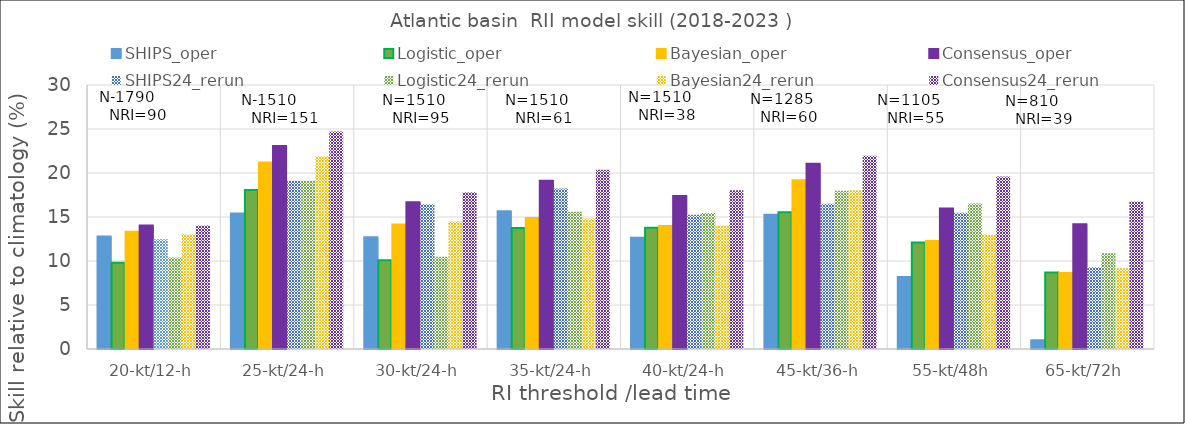
| Category | SHIPS_oper | Logistic_oper | Bayesian_oper | Consensus_oper | SHIPS24_rerun | Logistic24_rerun | Bayesian24_rerun | Consensus24_rerun |
|---|---|---|---|---|---|---|---|---|
| 20-kt/12-h | 12.77 | 9.81 | 13.31 | 14.02 | 12.48 | 10.41 | 13 | 14.03 |
| 25-kt/24-h | 15.39 | 18.07 | 21.18 | 23.08 | 19.11 | 19.11 | 21.9 | 24.73 |
| 30-kt/24-h | 12.69 | 10.09 | 14.15 | 16.67 | 16.45 | 10.47 | 14.5 | 17.8 |
| 35-kt/24-h | 15.64 | 13.76 | 14.89 | 19.12 | 18.23 | 15.59 | 14.83 | 20.38 |
| 40-kt/24-h | 12.64 | 13.79 | 13.99 | 17.38 | 15.26 | 15.45 | 14.03 | 18.03 |
| 45-kt/36-h | 15.25 | 15.55 | 19.18 | 21.04 | 16.5 | 17.98 | 18.03 | 21.95 |
| 55-kt/48h | 8.17 | 12.09 | 12.27 | 15.98 | 15.49 | 16.52 | 12.99 | 19.59 |
| 65-kt/72h | 1 | 8.7 | 8.63 | 14.17 | 9.3 | 10.89 | 9.19 | 16.75 |